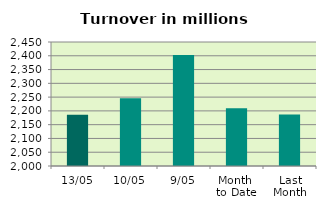
| Category | Series 0 |
|---|---|
| 13/05 | 2185.607 |
| 10/05 | 2246.072 |
| 9/05 | 2403.105 |
| Month 
to Date | 2209.891 |
| Last
Month | 2186.926 |